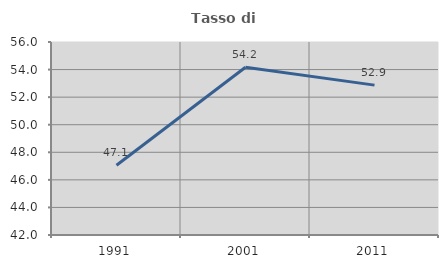
| Category | Tasso di occupazione   |
|---|---|
| 1991.0 | 47.063 |
| 2001.0 | 54.167 |
| 2011.0 | 52.873 |